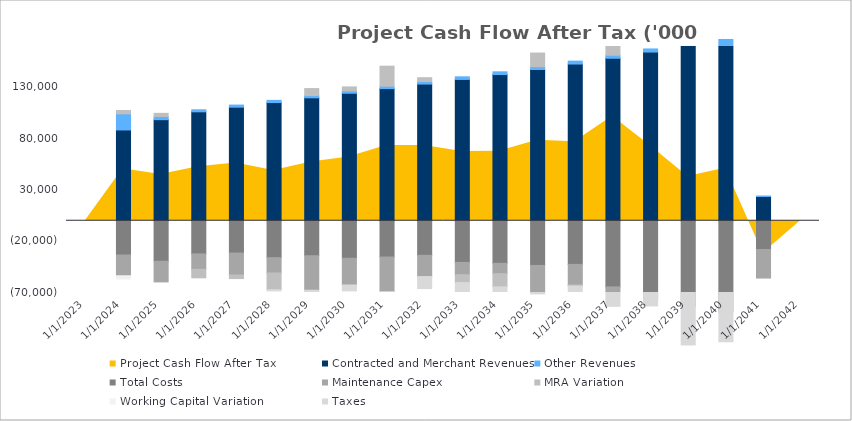
| Category | Contracted and Merchant Revenues | Other Revenues | Total Costs | Maintenance Capex | MRA Variation | Working Capital Variation | Taxes |
|---|---|---|---|---|---|---|---|
| 12/31/23 | 0 | 0 | 0 | 0 | 0 | 0 | 0 |
| 12/31/24 | 88590.933 | 15754.442 | -33435.938 | -20230.802 | 3236.869 | -3082.779 | 0 |
| 12/31/25 | 98609.85 | 3142.826 | -39511.003 | -20133.501 | 3031.529 | 0 | 0 |
| 12/31/26 | 106290.311 | 1976.912 | -32353.014 | -15029.33 | -8278.169 | 0 | 0 |
| 12/31/27 | 110796.875 | 2061.819 | -31534.551 | -21365.924 | -3504.294 | 0 | 0 |
| 12/31/28 | 115301.007 | 2136.009 | -36000.519 | -14910.662 | -16244.924 | 0 | -1233.905 |
| 12/31/29 | 119935.915 | 2213.016 | -34130.912 | -33645.91 | 6812.76 | 0 | -3853.695 |
| 12/31/30 | 124380.573 | 2292.951 | -36613.658 | -26054.082 | 3914.398 | 0 | -5724.482 |
| 12/31/31 | 128889.107 | 2375.932 | -35390.89 | -33766.766 | 19520.924 | 0 | -8115.668 |
| 12/31/32 | 133357.381 | 2462.081 | -33748.43 | -20678.603 | 3753.322 | 0 | -11729.513 |
| 12/31/33 | 137873.429 | 2551.525 | -40643.678 | -11973.683 | -7681.094 | 0 | -12535.717 |
| 12/31/34 | 142643.515 | 2644.398 | -41533.586 | -10085.239 | -12855.68 | 0 | -12983.827 |
| 12/31/35 | 147573.317 | 2740.837 | -43599.734 | -28716.921 | 13297.759 | 0 | -12831.243 |
| 12/31/36 | 152894.738 | 2845.037 | -42576.641 | -20162.172 | -988.443 | 0 | -14938.207 |
| 12/31/37 | 158525.603 | 2953.351 | -64532.432 | -19943.666 | 36496.941 | 0 | -11501.834 |
| 12/31/38 | 164606.364 | 3012.418 | -77945.853 | -6151.649 | 0 | 0 | -10065.93 |
| 12/31/39 | 171025.48 | 3072.666 | -84812.235 | -37356.53 | 0 | 0 | -8854.773 |
| 12/31/40 | 177850.561 | 3134.12 | -90073.833 | -28985.225 | 0 | 0 | -10757.423 |
| 12/31/41 | 23625.478 | 508.774 | -28057.278 | -27854.505 | 0 | 0 | 0 |
| 12/31/42 | 0 | 0 | 0 | 0 | 0 | 0 | 0 |
| 12/31/43 | 0 | 0 | 0 | 0 | 0 | 0 | 0 |
| 12/31/44 | 0 | 0 | 0 | 0 | 0 | 0 | 0 |
| 12/31/45 | 0 | 0 | 0 | 0 | 0 | 0 | 0 |
| 12/31/46 | 0 | 0 | 0 | 0 | 0 | 0 | 0 |
| 12/31/47 | 0 | 0 | 0 | 0 | 0 | 0 | 0 |
| 12/31/48 | 0 | 0 | 0 | 0 | 0 | 0 | 0 |
| 12/31/49 | 0 | 0 | 0 | 0 | 0 | 0 | 0 |
| 12/31/50 | 0 | 0 | 0 | 0 | 0 | 0 | 0 |
| 12/31/51 | 0 | 0 | 0 | 0 | 0 | 0 | 0 |
| 12/31/52 | 0 | 0 | 0 | 0 | 0 | 0 | 0 |
| 12/31/53 | 0 | 0 | 0 | 0 | 0 | 0 | 0 |
| 12/31/54 | 0 | 0 | 0 | 0 | 0 | 0 | 0 |
| 12/31/55 | 0 | 0 | 0 | 0 | 0 | 0 | 0 |
| 12/31/56 | 0 | 0 | 0 | 0 | 0 | 0 | 0 |
| 12/31/57 | 0 | 0 | 0 | 0 | 0 | 0 | 0 |
| 12/31/58 | 0 | 0 | 0 | 0 | 0 | 0 | 0 |
| 12/31/59 | 0 | 0 | 0 | 0 | 0 | 0 | 0 |
| 12/31/60 | 0 | 0 | 0 | 0 | 0 | 0 | 0 |
| 12/31/61 | 0 | 0 | 0 | 0 | 0 | 0 | 0 |
| 12/31/62 | 0 | 0 | 0 | 0 | 0 | 0 | 0 |
| 12/31/63 | 0 | 0 | 0 | 0 | 0 | 0 | 0 |
| 12/31/64 | 0 | 0 | 0 | 0 | 0 | 0 | 0 |
| 12/31/65 | 0 | 0 | 0 | 0 | 0 | 0 | 0 |
| 12/31/66 | 0 | 0 | 0 | 0 | 0 | 0 | 0 |
| 12/31/67 | 0 | 0 | 0 | 0 | 0 | 0 | 0 |
| 12/31/68 | 0 | 0 | 0 | 0 | 0 | 0 | 0 |
| 12/31/69 | 0 | 0 | 0 | 0 | 0 | 0 | 0 |
| 12/31/70 | 0 | 0 | 0 | 0 | 0 | 0 | 0 |
| 12/31/71 | 0 | 0 | 0 | 0 | 0 | 0 | 0 |
| 12/31/72 | 0 | 0 | 0 | 0 | 0 | 0 | 0 |
| 12/31/73 | 0 | 0 | 0 | 0 | 0 | 0 | 0 |
| 12/31/74 | 0 | 0 | 0 | 0 | 0 | 0 | 0 |
| 12/31/75 | 0 | 0 | 0 | 0 | 0 | 0 | 0 |
| 12/31/76 | 0 | 0 | 0 | 0 | 0 | 0 | 0 |
| 12/31/77 | 0 | 0 | 0 | 0 | 0 | 0 | 0 |
| 12/31/78 | 0 | 0 | 0 | 0 | 0 | 0 | 0 |
| 12/31/79 | 0 | 0 | 0 | 0 | 0 | 0 | 0 |
| 12/31/80 | 0 | 0 | 0 | 0 | 0 | 0 | 0 |
| 12/31/81 | 0 | 0 | 0 | 0 | 0 | 0 | 0 |
| 12/31/82 | 0 | 0 | 0 | 0 | 0 | 0 | 0 |